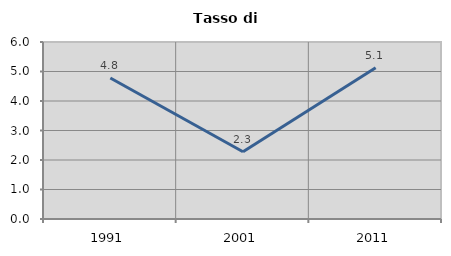
| Category | Tasso di disoccupazione   |
|---|---|
| 1991.0 | 4.779 |
| 2001.0 | 2.281 |
| 2011.0 | 5.128 |